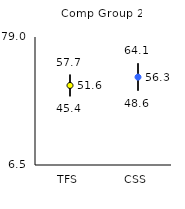
| Category | 25th | 75th | Mean |
|---|---|---|---|
| TFS | 45.4 | 57.7 | 51.55 |
| CSS | 48.6 | 64.1 | 56.28 |